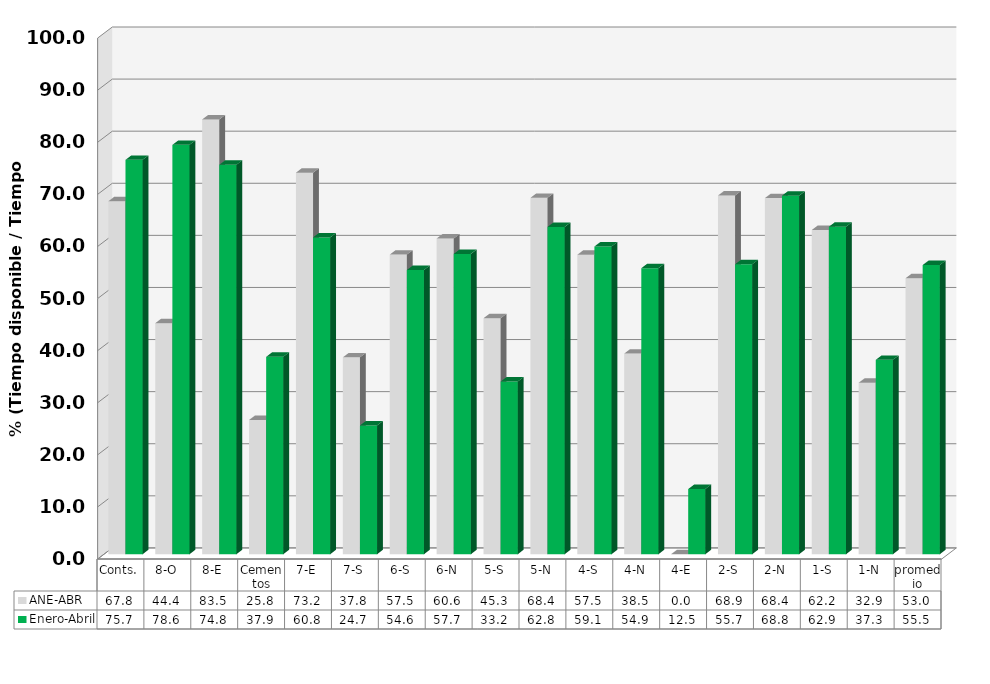
| Category | ANE-ABR | Enero-Abril |
|---|---|---|
| Conts. | 67.763 | 75.71 |
| 8-O | 44.353 | 78.583 |
| 8-E | 83.459 | 74.754 |
| Cementos | 25.766 | 37.897 |
| 7-E | 73.245 | 60.822 |
| 7-S | 37.788 | 24.719 |
| 6-S | 57.512 | 54.559 |
| 6-N | 60.603 | 57.653 |
| 5-S | 45.303 | 33.151 |
| 5-N | 68.41 | 62.831 |
| 4-S | 57.482 | 59.072 |
| 4-N | 38.513 | 54.907 |
| 4-E | 0 | 12.511 |
| 2-S | 68.857 | 55.656 |
| 2-N | 68.359 | 68.826 |
| 1-S | 62.235 | 62.866 |
| 1-N | 32.911 | 37.314 |
| promedio | 52.975 | 55.51 |